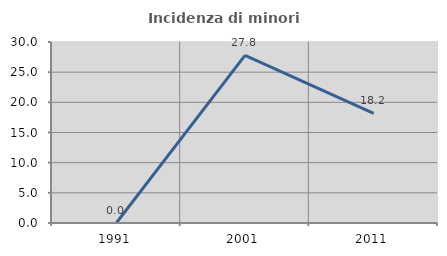
| Category | Incidenza di minori stranieri |
|---|---|
| 1991.0 | 0 |
| 2001.0 | 27.778 |
| 2011.0 | 18.182 |